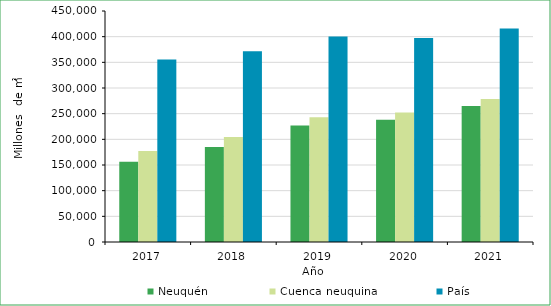
| Category | Neuquén | Cuenca neuquina | País |
|---|---|---|---|
| 2017.0 | 156092.848 | 177216.666 | 355547.433 |
| 2018.0 | 185065.059 | 204710.545 | 371565.956 |
| 2019.0 | 226921.056 | 242940.459 | 400231.081 |
| 2020.0 | 238177.042 | 252382.393 | 397246.415 |
| 2021.0 | 265112.088 | 278526.295 | 415988.345 |